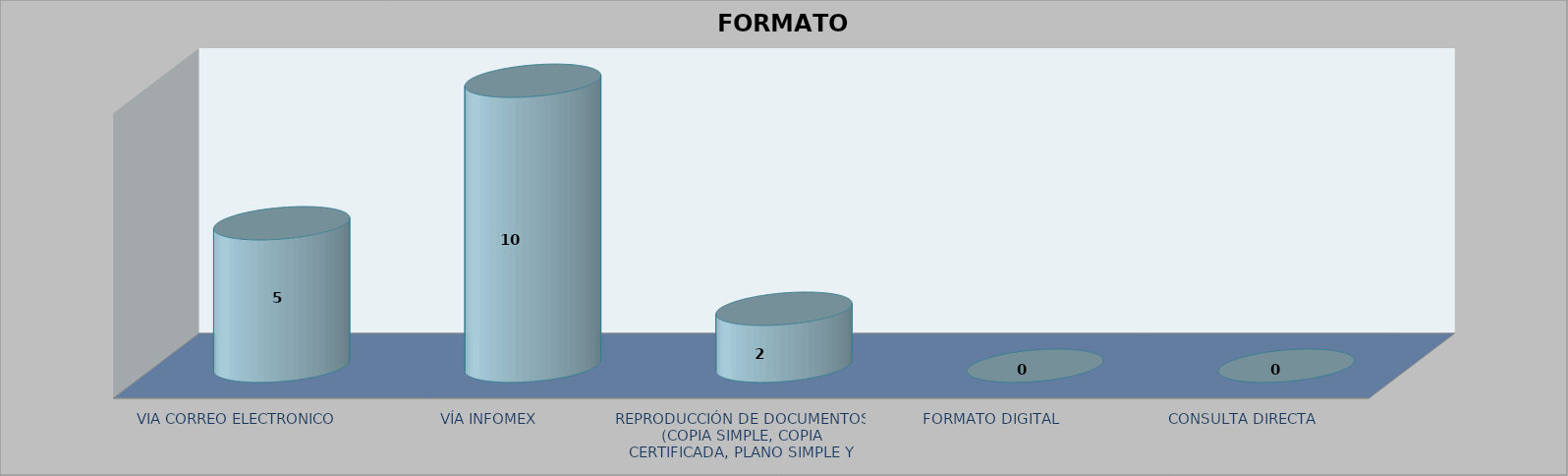
| Category |        FORMATO SOLICITADO | Series 1 | Series 2 |
|---|---|---|---|
| VIA CORREO ELECTRONICO |  |  | 5 |
| VÍA INFOMEX |  |  | 10 |
| REPRODUCCIÓN DE DOCUMENTOS (COPIA SIMPLE, COPIA CERTIFICADA, PLANO SIMPLE Y PLANO CERTIFICADO) |  |  | 2 |
| FORMATO DIGITAL |  |  | 0 |
| CONSULTA DIRECTA |  |  | 0 |